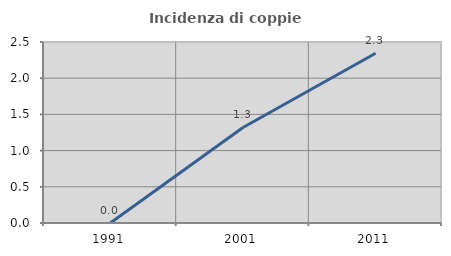
| Category | Incidenza di coppie miste |
|---|---|
| 1991.0 | 0 |
| 2001.0 | 1.319 |
| 2011.0 | 2.344 |